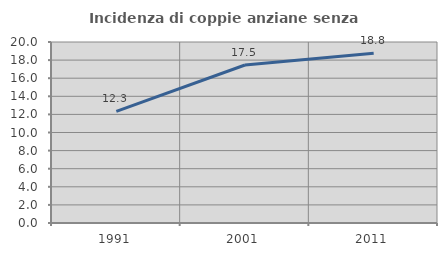
| Category | Incidenza di coppie anziane senza figli  |
|---|---|
| 1991.0 | 12.329 |
| 2001.0 | 17.46 |
| 2011.0 | 18.75 |